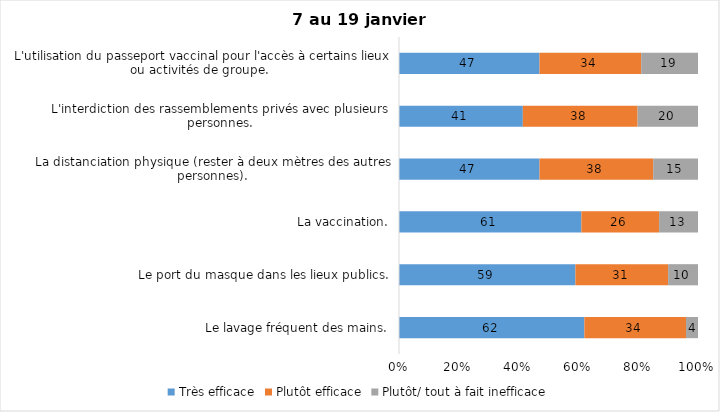
| Category | Très efficace | Plutôt efficace | Plutôt/ tout à fait inefficace |
|---|---|---|---|
| Le lavage fréquent des mains. | 62 | 34 | 4 |
| Le port du masque dans les lieux publics. | 59 | 31 | 10 |
| La vaccination. | 61 | 26 | 13 |
| La distanciation physique (rester à deux mètres des autres personnes). | 47 | 38 | 15 |
| L'interdiction des rassemblements privés avec plusieurs personnes. | 41 | 38 | 20 |
| L'utilisation du passeport vaccinal pour l'accès à certains lieux ou activités de groupe.  | 47 | 34 | 19 |